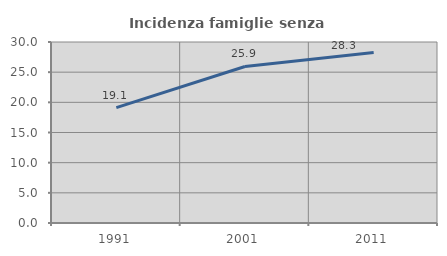
| Category | Incidenza famiglie senza nuclei |
|---|---|
| 1991.0 | 19.12 |
| 2001.0 | 25.945 |
| 2011.0 | 28.271 |